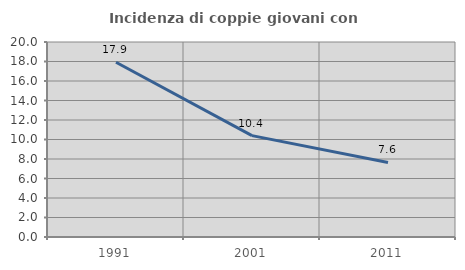
| Category | Incidenza di coppie giovani con figli |
|---|---|
| 1991.0 | 17.921 |
| 2001.0 | 10.397 |
| 2011.0 | 7.646 |